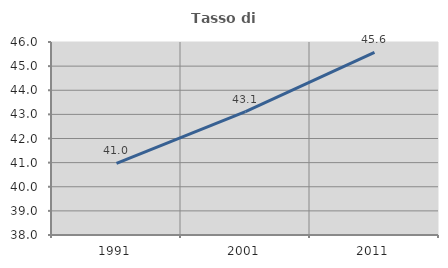
| Category | Tasso di occupazione   |
|---|---|
| 1991.0 | 40.967 |
| 2001.0 | 43.116 |
| 2011.0 | 45.567 |